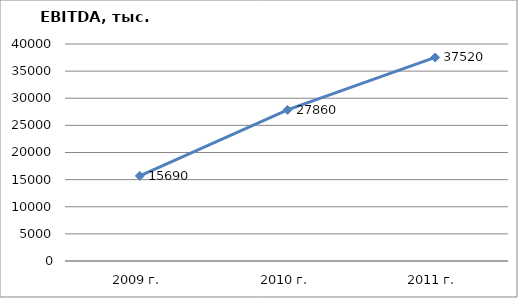
| Category | Series 0 |
|---|---|
| 2009 г. | 15690 |
| 2010 г. | 27860 |
| 2011 г. | 37520 |